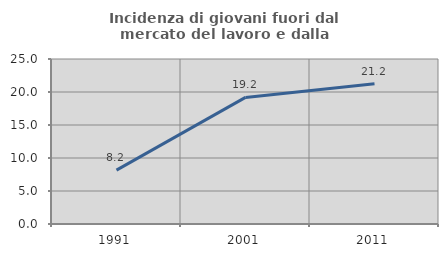
| Category | Incidenza di giovani fuori dal mercato del lavoro e dalla formazione  |
|---|---|
| 1991.0 | 8.171 |
| 2001.0 | 19.178 |
| 2011.0 | 21.235 |